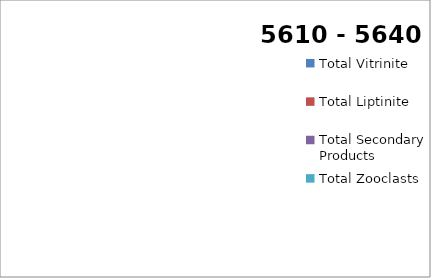
| Category | Series 6 | Series 0 |
|---|---|---|
| Total Vitrinite | 0 | 0 |
| Total Liptinite | 0 | 0 |
| Total  Inertinite | 0 | 0 |
| Total Secondary Products | 0 | 0 |
| Total Zooclasts | 0 | 0 |